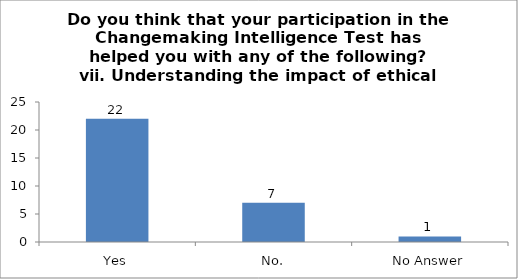
| Category | Do you think that your participation in the Changemaking Intelligence Test has helped you with any of the following?
vii. Understanding the impact of ethical choices. |
|---|---|
| Yes | 22 |
| No. | 7 |
| No Answer | 1 |